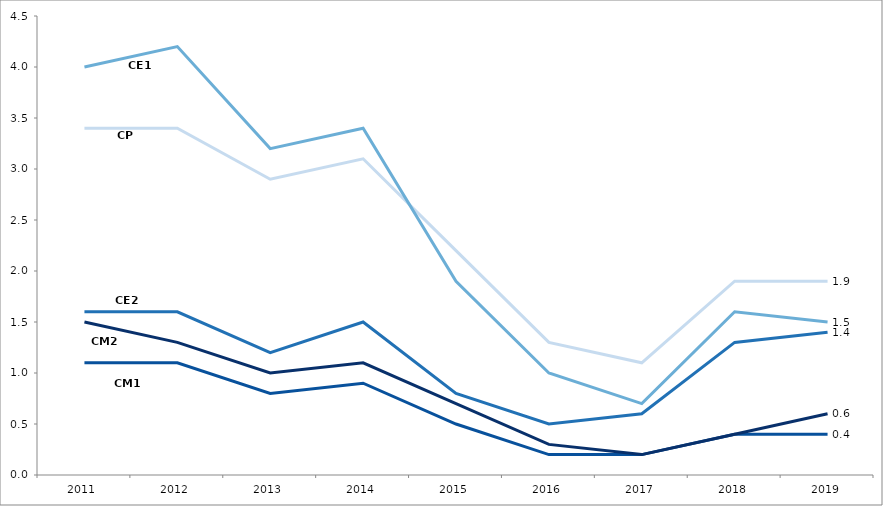
| Category | CP | CE1 | CE2 | CM1 | CM2 |
|---|---|---|---|---|---|
| 2011.0 | 3.4 | 4 | 1.6 | 1.1 | 1.5 |
| 2012.0 | 3.4 | 4.2 | 1.6 | 1.1 | 1.3 |
| 2013.0 | 2.9 | 3.2 | 1.2 | 0.8 | 1 |
| 2014.0 | 3.1 | 3.4 | 1.5 | 0.9 | 1.1 |
| 2015.0 | 2.2 | 1.9 | 0.8 | 0.5 | 0.7 |
| 2016.0 | 1.3 | 1 | 0.5 | 0.2 | 0.3 |
| 2017.0 | 1.1 | 0.7 | 0.6 | 0.2 | 0.2 |
| 2018.0 | 1.9 | 1.6 | 1.3 | 0.4 | 0.4 |
| 2019.0 | 1.9 | 1.5 | 1.4 | 0.4 | 0.6 |